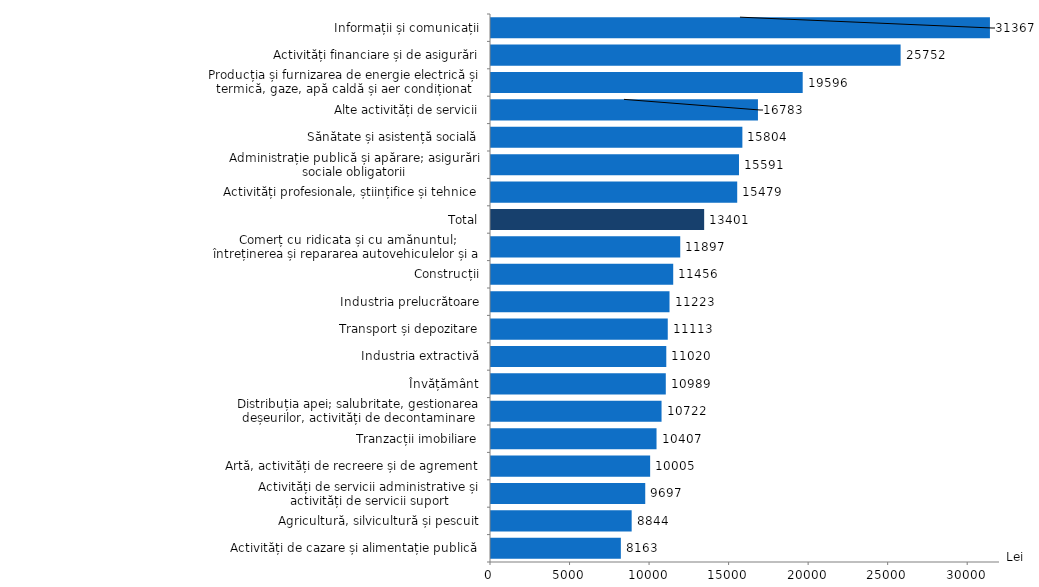
| Category | Lei |
|---|---|
| Activități de cazare și alimentație publică | 8163.4 |
| Agricultură, silvicultură și pescuit | 8843.6 |
| Activități de servicii administrative și activități de servicii suport | 9696.8 |
| Artă, activități de recreere și de agrement | 10005.3 |
| Tranzacții imobiliare | 10406.8 |
| Distribuția apei; salubritate, gestionarea deșeurilor, activități de decontaminare | 10722.1 |
| Învățământ | 10989 |
| Industria extractivă | 11020.3 |
| Transport și depozitare | 11112.5 |
| Industria prelucrătoare | 11222.9 |
| Construcții | 11455.5 |
| Comerț cu ridicata și cu amănuntul; întreținerea și repararea autovehiculelor și a motocicletelor | 11897.2 |
| Total | 13401.1 |
| Activități profesionale, științifice și tehnice | 15478.9 |
| Administrație publică și apărare; asigurări sociale obligatorii | 15590.8 |
| Sănătate și asistență socială | 15804 |
| Alte activități de servicii | 16782.6 |
| Producția și furnizarea de energie electrică și termică, gaze, apă caldă și aer condiționat | 19595.8 |
| Activități financiare și de asigurări | 25751.6 |
| Informații și comunicații | 31367 |